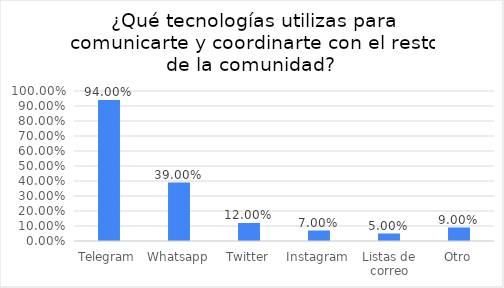
| Category | Series 0 |
|---|---|
| Telegram | 0.94 |
| Whatsapp | 0.39 |
| Twitter | 0.12 |
| Instagram | 0.07 |
| Listas de correo | 0.05 |
| Otro | 0.09 |